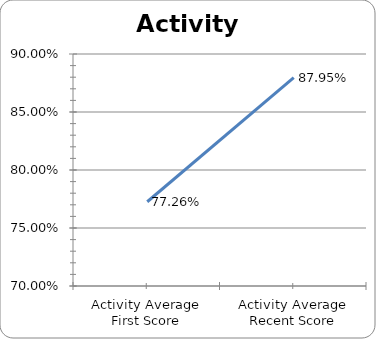
| Category | Series 0 |
|---|---|
| Activity Average First Score | 0.773 |
| Activity Average Recent Score | 0.88 |